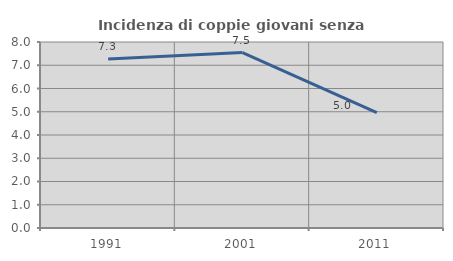
| Category | Incidenza di coppie giovani senza figli |
|---|---|
| 1991.0 | 7.268 |
| 2001.0 | 7.543 |
| 2011.0 | 4.962 |